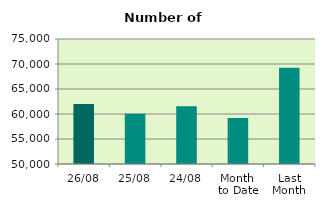
| Category | Series 0 |
|---|---|
| 26/08 | 61994 |
| 25/08 | 60042 |
| 24/08 | 61550 |
| Month 
to Date | 59181.158 |
| Last
Month | 69237.818 |